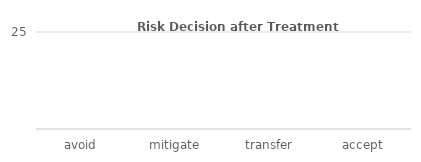
| Category | 1. Data Breach | 2. Human Factor | 3. Infrastructure | 4. Physical Security | 5. Regulatory and Compliance | 6. Supply Chain |
|---|---|---|---|---|---|---|
| avoid | 0 | 0 | 0 | 0 | 0 | 0 |
| mitigate | 0 | 0 | 0 | 0 | 0 | 0 |
| transfer | 0 | 0 | 0 | 0 | 0 | 0 |
| accept | 0 | 0 | 0 | 0 | 0 | 0 |